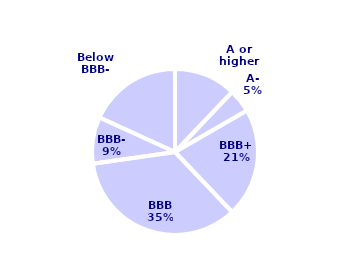
| Category | Series 0 |
|---|---|
| A or higher | 0.121 |
| A- | 0.045 |
| BBB+ | 0.212 |
| BBB | 0.348 |
| BBB- | 0.091 |
| Below BBB- | 0.182 |